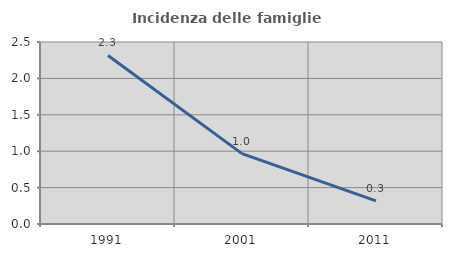
| Category | Incidenza delle famiglie numerose |
|---|---|
| 1991.0 | 2.315 |
| 2001.0 | 0.966 |
| 2011.0 | 0.317 |